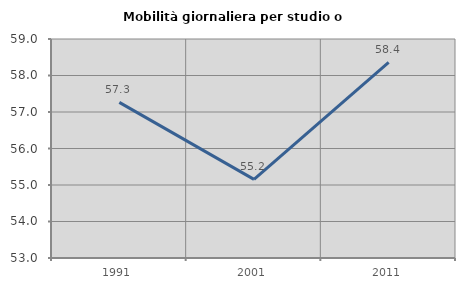
| Category | Mobilità giornaliera per studio o lavoro |
|---|---|
| 1991.0 | 57.264 |
| 2001.0 | 55.153 |
| 2011.0 | 58.359 |